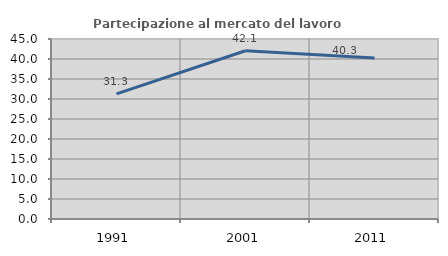
| Category | Partecipazione al mercato del lavoro  femminile |
|---|---|
| 1991.0 | 31.298 |
| 2001.0 | 42.056 |
| 2011.0 | 40.275 |